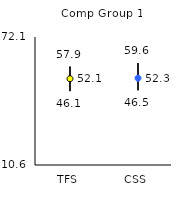
| Category | 25th | 75th | Mean |
|---|---|---|---|
| TFS | 46.1 | 57.9 | 52.06 |
| CSS | 46.5 | 59.6 | 52.29 |